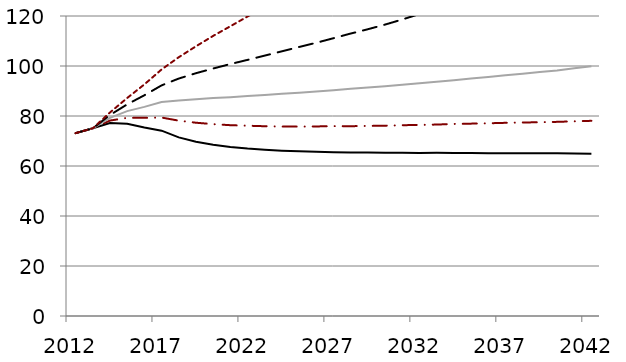
| Category | Series 0 | Series 1 | Series 2 | Series 3 | Series 4 |
|---|---|---|---|---|---|
| 2012.0 | 73.14 | 73.14 | 73.14 | 73.14 | 73.14 |
| 2013.0 | 75.076 | 75.076 | 75.076 | 75.076 | 75.076 |
| 2014.0 | 77.159 | 78.174 | 79.289 | 80.402 | 81.412 |
| 2015.0 | 76.886 | 79.264 | 81.939 | 84.652 | 87.197 |
| 2016.0 | 75.433 | 79.258 | 83.659 | 88.299 | 92.636 |
| 2017.0 | 74.143 | 79.379 | 85.602 | 92.242 | 98.608 |
| 2018.0 | 71.437 | 78.138 | 86.226 | 94.978 | 103.51 |
| 2019.0 | 69.688 | 77.311 | 86.72 | 97.116 | 107.88 |
| 2020.0 | 68.534 | 76.747 | 87.163 | 98.996 | 112.04 |
| 2021.0 | 67.616 | 76.326 | 87.514 | 100.78 | 115.89 |
| 2022.0 | 66.958 | 76.115 | 87.971 | 102.45 | 119.79 |
| 2023.0 | 66.476 | 75.907 | 88.437 | 104.16 | 123.75 |
| 2024.0 | 66.133 | 75.784 | 88.899 | 105.87 | 127.56 |
| 2025.0 | 65.862 | 75.766 | 89.323 | 107.61 | 131.32 |
| 2026.0 | 65.678 | 75.825 | 89.794 | 109.3 | 135.23 |
| 2027.0 | 65.523 | 75.948 | 90.316 | 111.12 | 139.3 |
| 2028.0 | 65.443 | 75.92 | 90.852 | 112.99 | 143.33 |
| 2029.0 | 65.358 | 76.039 | 91.414 | 114.71 | 147.56 |
| 2030.0 | 65.298 | 76.118 | 91.943 | 116.57 | 151.96 |
| 2031.0 | 65.27 | 76.319 | 92.469 | 118.6 | 156.68 |
| 2032.0 | 65.243 | 76.418 | 93.063 | 120.8 | 161.27 |
| 2033.0 | 65.278 | 76.576 | 93.71 | 122.88 | 166 |
| 2034.0 | 65.237 | 76.825 | 94.316 | 125.15 | 170.96 |
| 2035.0 | 65.212 | 76.946 | 94.99 | 127.53 | 176.02 |
| 2036.0 | 65.122 | 77.082 | 95.592 | 129.98 | 181.7 |
| 2037.0 | 65.121 | 77.271 | 96.26 | 132.51 | 187.51 |
| 2038.0 | 65.126 | 77.408 | 96.903 | 135.08 | 193.63 |
| 2039.0 | 65.138 | 77.496 | 97.568 | 138.03 | 200.15 |
| 2040.0 | 65.132 | 77.657 | 98.247 | 140.96 | 207.27 |
| 2041.0 | 65.049 | 77.874 | 99.123 | 144.1 | 214.71 |
| 2042.0 | 64.895 | 78.073 | 99.917 | 147.41 | 222.66 |